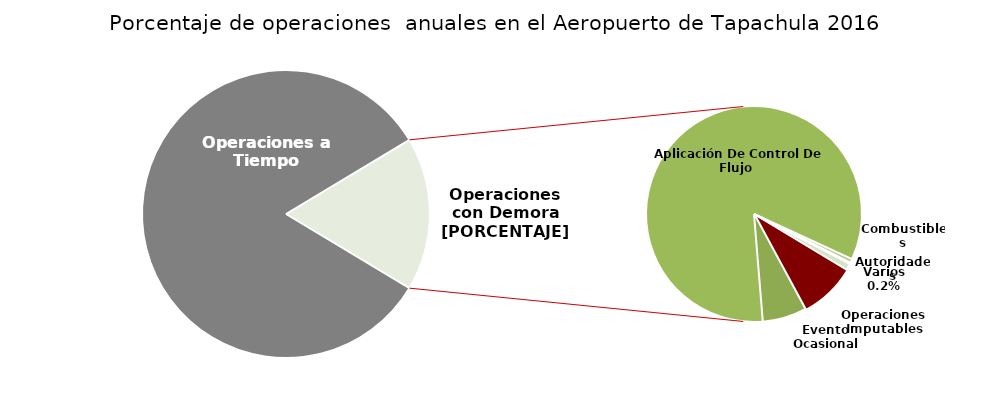
| Category | Series 0 |
|---|---|
| Operaciones a Tiempo | 2485 |
| Operaciones Imputables | 44 |
| Evento Ocasional | 34 |
| Aplicación De Control De Flujo  | 430 |
| Combustibles | 3 |
| Autoridades | 1 |
| Varios | 5 |